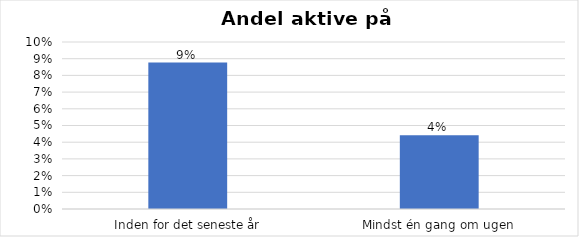
| Category | % |
|---|---|
| Inden for det seneste år | 0.088 |
| Mindst én gang om ugen | 0.044 |